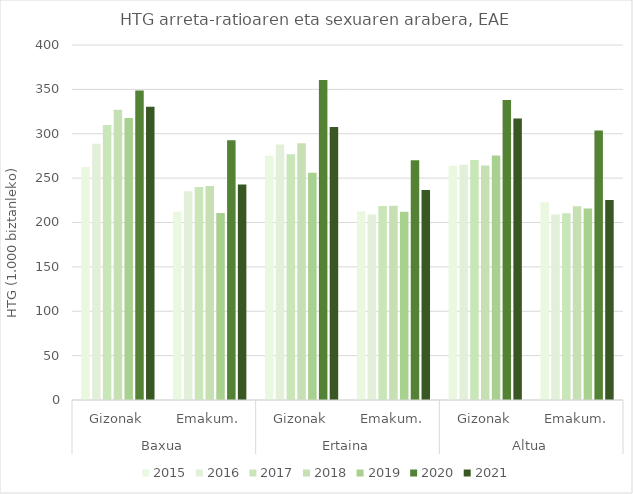
| Category | 2015 | 2016 | 2017 | 2018 | 2019 | 2020 | 2021 |
|---|---|---|---|---|---|---|---|
| 0 | 262.673 | 288.725 | 309.913 | 327.138 | 317.657 | 348.858 | 330.537 |
| 1 | 212.096 | 235.338 | 239.889 | 241.135 | 210.726 | 292.593 | 242.91 |
| 2 | 275.165 | 287.835 | 276.899 | 289.203 | 256.071 | 360.474 | 307.736 |
| 3 | 212.484 | 208.92 | 218.478 | 218.796 | 212.133 | 270.023 | 236.597 |
| 4 | 263.975 | 265.122 | 270.488 | 264.349 | 275.489 | 338.1 | 317.075 |
| 5 | 222.812 | 209.05 | 210.436 | 218.284 | 215.881 | 303.648 | 225.298 |